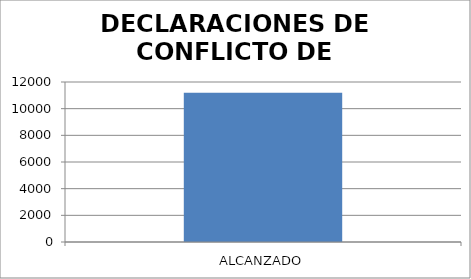
| Category | DECLARACIONES DE CONFLICTO DE INTERESES |
|---|---|
| ALCANZADO | 11199 |